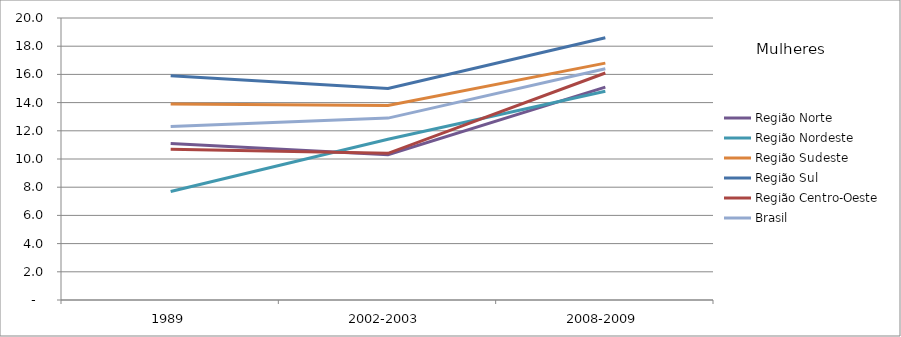
| Category | Região Norte | Região Nordeste | Região Sudeste | Região Sul | Região Centro-Oeste | Brasil |
|---|---|---|---|---|---|---|
| 1989 | 11.1 | 7.7 | 13.9 | 15.9 | 10.7 | 12.3 |
| 2002-2003 | 10.3 | 11.4 | 13.8 | 15 | 10.4 | 12.9 |
| 2008-2009 | 15.1 | 14.8 | 16.8 | 18.6 | 16.1 | 16.4 |